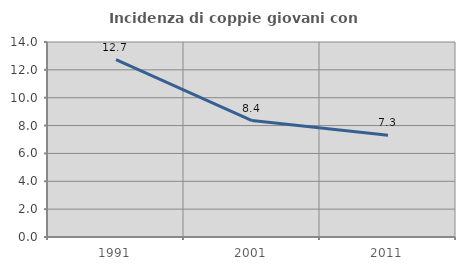
| Category | Incidenza di coppie giovani con figli |
|---|---|
| 1991.0 | 12.739 |
| 2001.0 | 8.359 |
| 2011.0 | 7.302 |